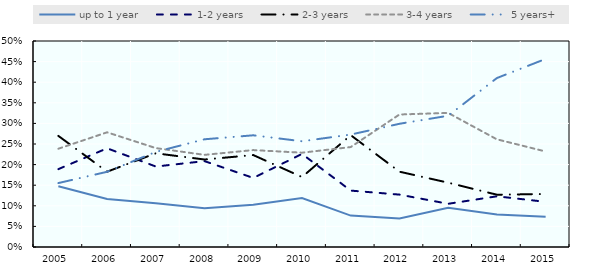
| Category | up to 1 year | 1-2 years | 2-3 years | 3-4 years | 5 years+ |
|---|---|---|---|---|---|
| 2005.0 | 0.148 | 0.189 | 0.27 | 0.239 | 0.155 |
| 2006.0 | 0.117 | 0.24 | 0.183 | 0.278 | 0.183 |
| 2007.0 | 0.106 | 0.195 | 0.227 | 0.24 | 0.231 |
| 2008.0 | 0.094 | 0.208 | 0.212 | 0.224 | 0.261 |
| 2009.0 | 0.103 | 0.168 | 0.223 | 0.235 | 0.271 |
| 2010.0 | 0.119 | 0.226 | 0.17 | 0.229 | 0.257 |
| 2011.0 | 0.076 | 0.137 | 0.271 | 0.243 | 0.273 |
| 2012.0 | 0.069 | 0.127 | 0.183 | 0.322 | 0.299 |
| 2013.0 | 0.095 | 0.105 | 0.156 | 0.325 | 0.319 |
| 2014.0 | 0.079 | 0.123 | 0.127 | 0.261 | 0.41 |
| 2015.0 | 0.073 | 0.11 | 0.129 | 0.232 | 0.457 |